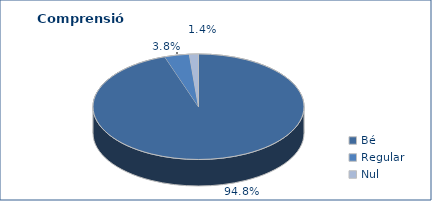
| Category | Series 0 |
|---|---|
| Bé | 5449 |
| Regular | 218 |
| Nul | 80 |